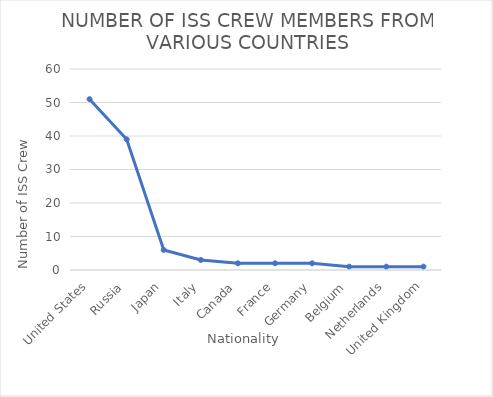
| Category | ISS Crew |
|---|---|
|  United States | 51 |
|  Russia | 39 |
|  Japan | 6 |
|  Italy | 3 |
|  Canada | 2 |
|  France | 2 |
|  Germany | 2 |
|  Belgium | 1 |
|  Netherlands | 1 |
|  United Kingdom | 1 |